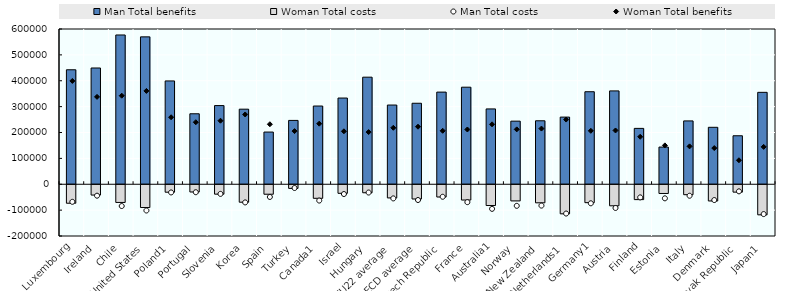
| Category | Man Total benefits | Woman Total costs |
|---|---|---|
| Luxembourg | 442400 | -71400 |
| Ireland | 449300 | -39800 |
| Chile | 576900 | -68400 |
| United States | 569600 | -88000 |
| Poland1 | 399300 | -28800 |
| Portugal | 272400 | -27900 |
| Slovenia | 304100 | -36300 |
| Korea | 290100 | -67400 |
| Spain | 201700 | -36600 |
| Turkey | 246700 | -14100 |
| Canada1 | 302300 | -52400 |
| Israel | 333200 | -33100 |
| Hungary | 413800 | -30900 |
| EU22 average | 306100 | -50900 |
| OECD average | 313000 | -55000 |
| Czech Republic | 356100 | -47300 |
| France | 375100 | -59000 |
| Australia1 | 291100 | -80300 |
| Norway | 243900 | -62400 |
| New Zealand | 245300 | -69800 |
| Netherlands1 | 259500 | -112300 |
| Germany1 | 357600 | -69200 |
| Austria | 360800 | -81300 |
| Finland | 215900 | -57400 |
| Estonia | 143700 | -33700 |
| Italy | 244800 | -38400 |
| Denmark | 220100 | -62600 |
| Slovak Republic | 187400 | -28500 |
| Japan1 | 355200 | -116200 |